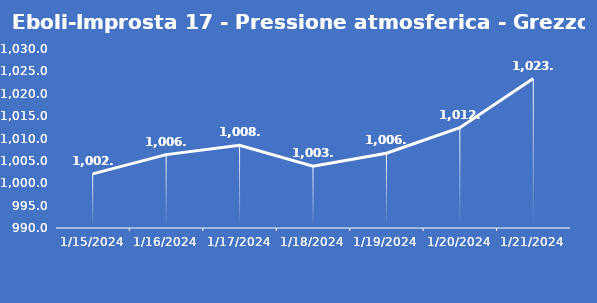
| Category | Eboli-Improsta 17 - Pressione atmosferica - Grezzo (hPa) |
|---|---|
| 1/15/24 | 1002.1 |
| 1/16/24 | 1006.4 |
| 1/17/24 | 1008.5 |
| 1/18/24 | 1003.8 |
| 1/19/24 | 1006.7 |
| 1/20/24 | 1012.4 |
| 1/21/24 | 1023.4 |